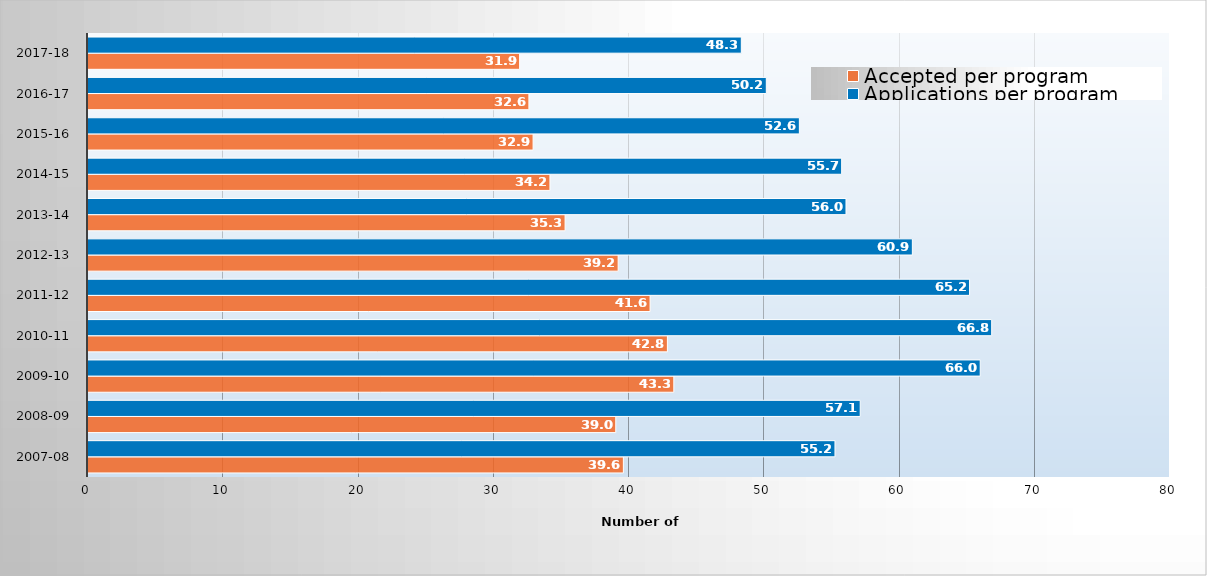
| Category | Accepted per program | Applications per program |
|---|---|---|
| 2007-08 | 39.583 | 55.229 |
| 2008-09 | 39.022 | 57.096 |
| 2009-10 | 43.314 | 65.968 |
| 2010-11 | 42.839 | 66.817 |
| 2011-12 | 41.557 | 65.181 |
| 2012-13 | 39.198 | 60.95 |
| 2013-14 | 35.275 | 56.044 |
| 2014-15 | 34.154 | 55.724 |
| 2015-16 | 32.909 | 52.597 |
| 2016-17 | 32.599 | 50.152 |
| 2017-18 | 31.913 | 48.304 |